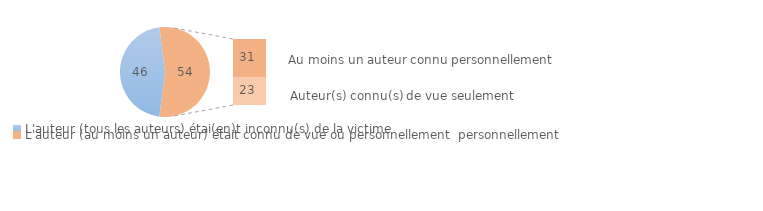
| Category | Series 0 |
|---|---|
| 0 | 46 |
| 1 | 0 |
| 2 | 31 |
| 3 | 23 |